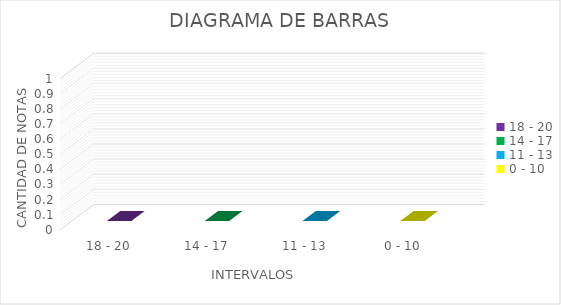
| Category | Series 0 |
|---|---|
| 18 - 20 | 0 |
| 14 - 17 | 0 |
| 11 - 13 | 0 |
| 0 - 10 | 0 |